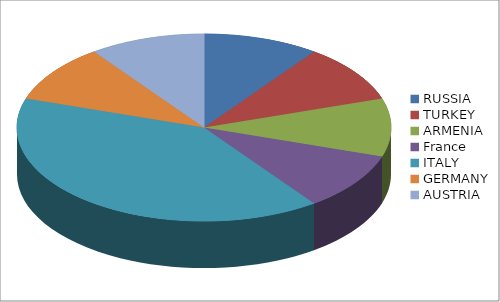
| Category | Series 0 |
|---|---|
| RUSSIA | 1 |
| TURKEY | 1 |
| ARMENIA | 1 |
| France | 1 |
| ITALY | 4 |
| GERMANY | 1 |
| AUSTRIA | 1 |